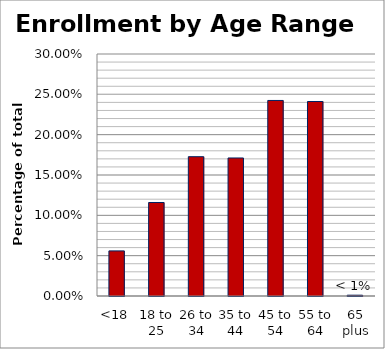
| Category | Series 0 |
|---|---|
| <18 | 0.056 |
| 18 to 25 | 0.116 |
| 26 to 34 | 0.173 |
| 35 to 44 | 0.171 |
| 45 to 54 | 0.242 |
| 55 to 64 | 0.241 |
| 65 plus | 0.001 |